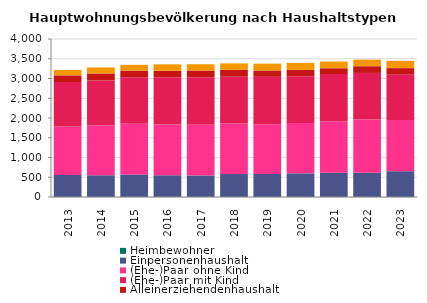
| Category | Heimbewohner | Einpersonenhaushalt | (Ehe-)Paar ohne Kind | (Ehe-)Paar mit Kind | Alleinerziehendenhaushalt | sonstiger Mehrpersonenhaushalt |
|---|---|---|---|---|---|---|
| 2013.0 | 0 | 557 | 1226 | 1127 | 170 | 137 |
| 2014.0 | 0 | 551 | 1259 | 1136 | 182 | 152 |
| 2015.0 | 0 | 572 | 1280 | 1178 | 170 | 146 |
| 2016.0 | 0 | 551 | 1283 | 1199 | 164 | 161 |
| 2017.0 | 0 | 545 | 1283 | 1205 | 170 | 158 |
| 2018.0 | 0 | 581 | 1280 | 1184 | 176 | 161 |
| 2019.0 | 0 | 584 | 1259 | 1199 | 161 | 173 |
| 2020.0 | 0 | 599 | 1274 | 1184 | 161 | 179 |
| 2021.0 | 0 | 617 | 1292 | 1202 | 149 | 170 |
| 2022.0 | 0 | 614 | 1349 | 1178 | 170 | 167 |
| 2023.0 | 0 | 653 | 1298 | 1154 | 158 | 185 |